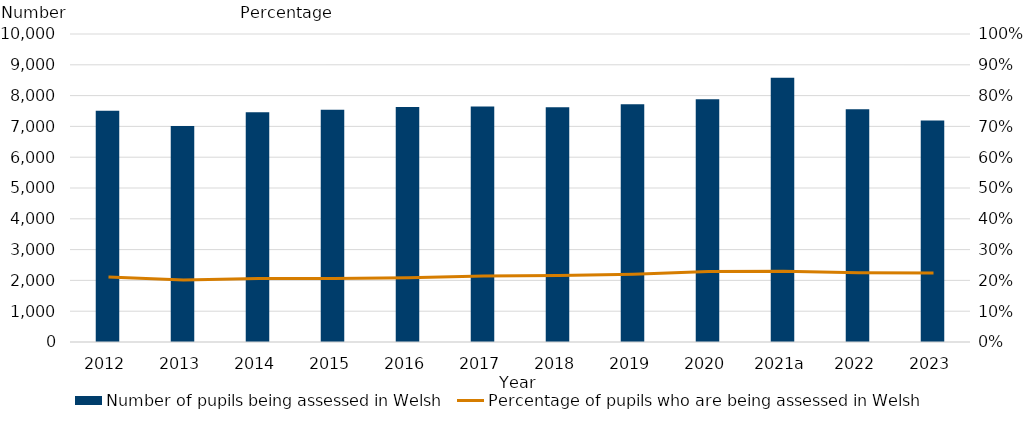
| Category | Number of pupils being assessed in Welsh |
|---|---|
| 2012 | 7505 |
| 2013 | 7010 |
| 2014 | 7460 |
| 2015 | 7540 |
| 2016 | 7630 |
| 2017 | 7650 |
| 2018 | 7625 |
| 2019 | 7720 |
| 2020 | 7880 |
| 2021a | 8580 |
| 2022 | 7555 |
| 2023 | 7195 |